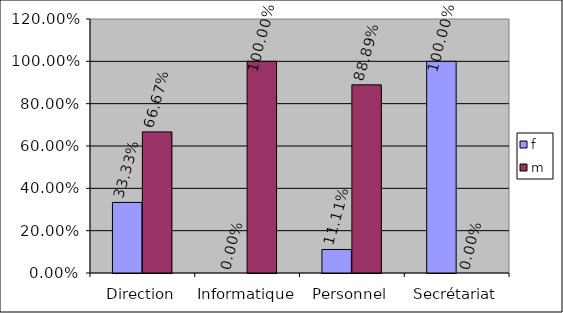
| Category | f | m |
|---|---|---|
| Direction | 0.333 | 0.667 |
| Informatique | 0 | 1 |
| Personnel | 0.111 | 0.889 |
| Secrétariat | 1 | 0 |